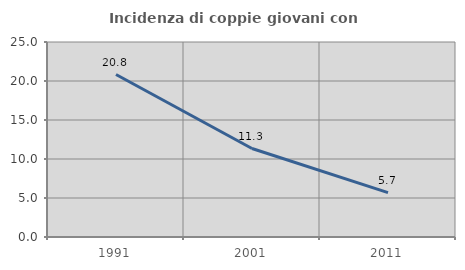
| Category | Incidenza di coppie giovani con figli |
|---|---|
| 1991.0 | 20.829 |
| 2001.0 | 11.341 |
| 2011.0 | 5.694 |